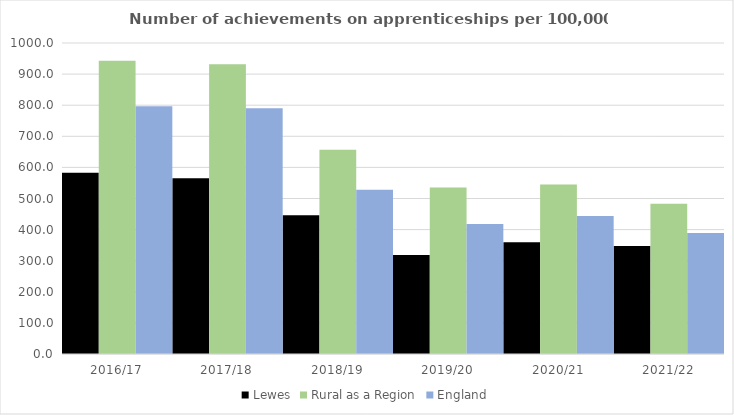
| Category | Lewes | Rural as a Region | England |
|---|---|---|---|
| 2016/17 | 583 | 942.594 | 797 |
| 2017/18 | 565 | 931.709 | 790 |
| 2018/19 | 446 | 656.44 | 528 |
| 2019/20 | 318 | 535.552 | 418 |
| 2020/21 | 359 | 545.333 | 444 |
| 2021/22 | 347 | 482.936 | 389 |